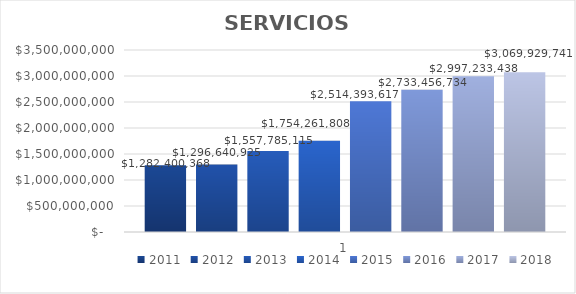
| Category | 2011 | 2012 | 2013 | 2014 | 2015 | 2016 | 2017 | 2018 |
|---|---|---|---|---|---|---|---|---|
| 0 | 1282400368 | 1296640925 | 1557785115 | 1754261808.342 | 2514393617 | 2733456733.54 | 2997233437.57 | 3069929741.45 |